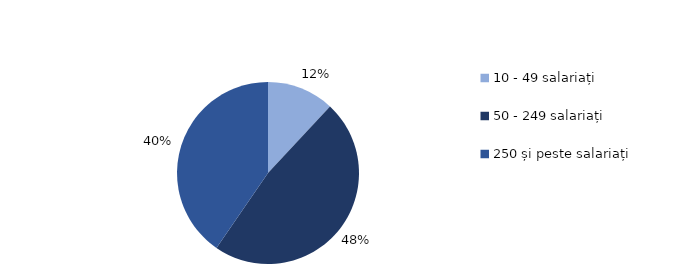
| Category | Series 0 |
|---|---|
| 10 - 49 salariați | 0.119 |
| 50 - 249 salariați | 0.477 |
| 250 și peste salariați | 0.404 |